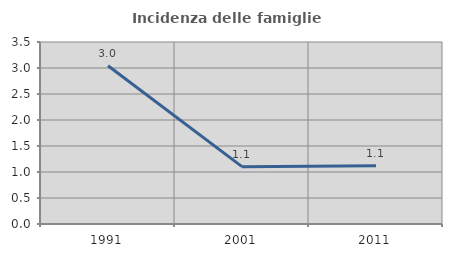
| Category | Incidenza delle famiglie numerose |
|---|---|
| 1991.0 | 3.044 |
| 2001.0 | 1.103 |
| 2011.0 | 1.118 |